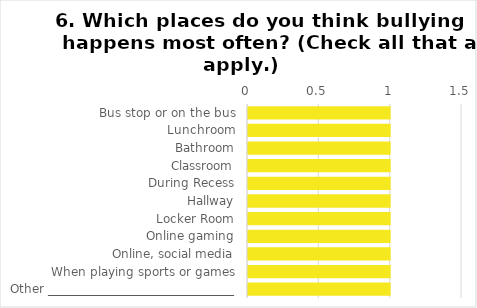
| Category | Field1 |
|---|---|
| Bus stop or on the bus | 1 |
| Lunchroom | 1 |
| Bathroom | 1 |
| Classroom | 1 |
| During Recess | 1 |
| Hallway | 1 |
| Locker Room | 1 |
| Online gaming | 1 |
| Online, social media | 1 |
| When playing sports or games | 1 |
| Other _______________________________ | 1 |